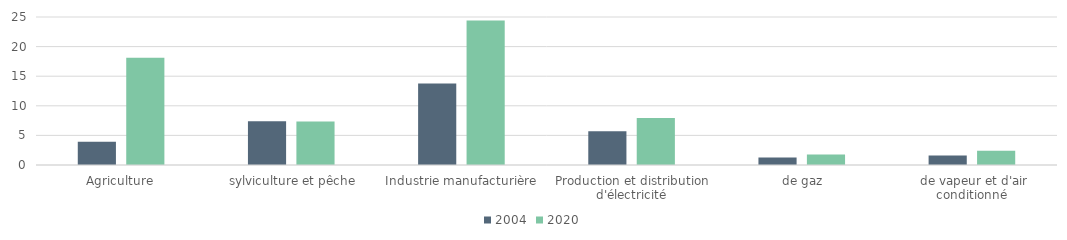
| Category | 2004 | 2020 |
|---|---|---|
| 0 | 3.919 | 18.099 |
| 1 | 7.399 | 7.336 |
| 2 | 13.766 | 24.414 |
| 3 | 5.715 | 7.957 |
| 4 | 1.258 | 1.763 |
| 5 | 1.605 | 2.403 |